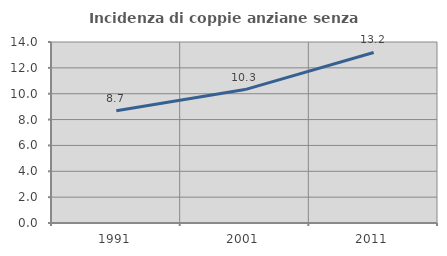
| Category | Incidenza di coppie anziane senza figli  |
|---|---|
| 1991.0 | 8.675 |
| 2001.0 | 10.321 |
| 2011.0 | 13.191 |